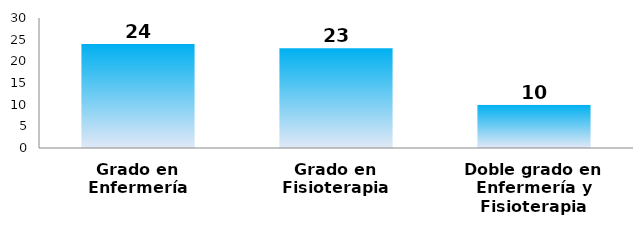
| Category | Series 0 |
|---|---|
| Grado en Enfermería | 24 |
| Grado en Fisioterapia | 23 |
| Doble grado en Enfermería y Fisioterapia | 10 |